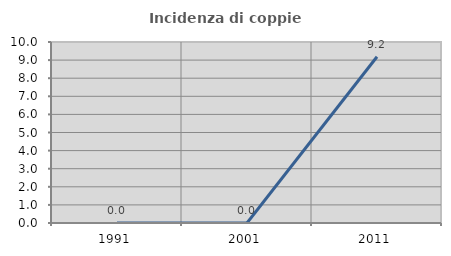
| Category | Incidenza di coppie miste |
|---|---|
| 1991.0 | 0 |
| 2001.0 | 0 |
| 2011.0 | 9.184 |